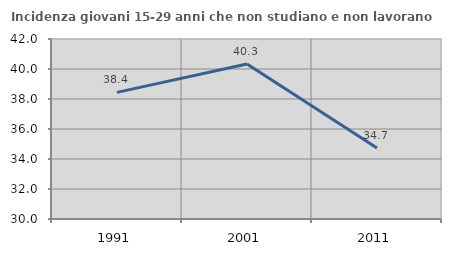
| Category | Incidenza giovani 15-29 anni che non studiano e non lavorano  |
|---|---|
| 1991.0 | 38.441 |
| 2001.0 | 40.331 |
| 2011.0 | 34.731 |